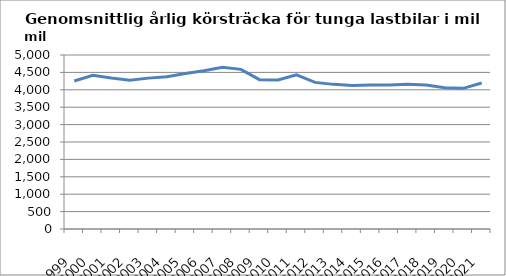
| Category | Series 0 |
|---|---|
| 1999.0 | 4254.457 |
| 2000.0 | 4417.481 |
| 2001.0 | 4338.935 |
| 2002.0 | 4273.062 |
| 2003.0 | 4335.437 |
| 2004.0 | 4376.916 |
| 2005.0 | 4466.823 |
| 2006.0 | 4548.139 |
| 2007.0 | 4648.035 |
| 2008.0 | 4586.986 |
| 2009.0 | 4291.782 |
| 2010.0 | 4282.082 |
| 2011.0 | 4430.621 |
| 2012.0 | 4212.675 |
| 2013.0 | 4156.089 |
| 2014.0 | 4125.245 |
| 2015.0 | 4136.48 |
| 2016.0 | 4138.792 |
| 2017.0 | 4162.39 |
| 2018.0 | 4137.578 |
| 2019.0 | 4057.497 |
| 2020.0 | 4041.379 |
| 2021.0 | 4196.609 |